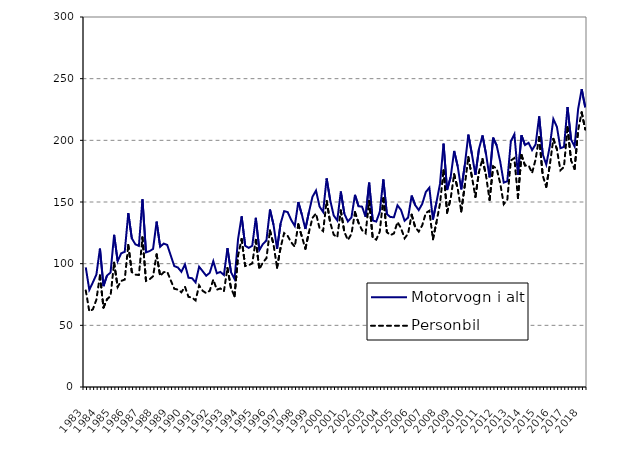
| Category | Motorvogn i alt | Personbil |
|---|---|---|
| 1983.0 | 97 | 78.3 |
| nan | 78.8 | 61.3 |
| nan | 84.8 | 63 |
| nan | 91.2 | 70.8 |
| 1984.0 | 112.2 | 90.4 |
| nan | 81.8 | 64.4 |
| nan | 90.4 | 71.1 |
| nan | 92.9 | 73.9 |
| 1985.0 | 123.4 | 100.8 |
| nan | 102 | 81.1 |
| nan | 108.4 | 86 |
| nan | 109.6 | 87.1 |
| 1986.0 | 141 | 115.2 |
| nan | 120.5 | 93.2 |
| nan | 115.7 | 91.1 |
| nan | 114.4 | 90.8 |
| 1987.0 | 152.2 | 121.3 |
| nan | 109.2 | 86.1 |
| nan | 110.1 | 87.3 |
| nan | 112 | 89.8 |
| 1988.0 | 134.1 | 107.5 |
| nan | 113.7 | 90 |
| nan | 116.3 | 93.1 |
| nan | 115.2 | 93.4 |
| 1989.0 | 106.6 | 86.4 |
| nan | 98 | 79.6 |
| nan | 96.9 | 79 |
| nan | 93.4 | 76.8 |
| 1990.0 | 99.4 | 81.3 |
| nan | 88.6 | 73.1 |
| nan | 88.2 | 72.5 |
| nan | 84.8 | 70.2 |
| 1991.0 | 97.5 | 82.4 |
| nan | 93.9 | 78 |
| nan | 90.2 | 76.1 |
| nan | 92.6 | 78.1 |
| 1992.0 | 102 | 87.1 |
| nan | 92.2 | 78.9 |
| nan | 93.3 | 79.9 |
| nan | 90.8 | 77.6 |
| 1993.0 | 112.6 | 96.5 |
| nan | 93 | 80.1 |
| nan | 87.5 | 73.6 |
| nan | 120.1 | 106.6 |
| 1994.0 | 138.4 | 120 |
| nan | 114.5 | 98.1 |
| nan | 112.8 | 98.8 |
| nan | 114.5 | 100.2 |
| 1995.0 | 137.2 | 119.3 |
| nan | 111 | 95.4 |
| nan | 115.9 | 101 |
| nan | 118.8 | 104.4 |
| 1996.0 | 143.9 | 126.9 |
| nan | 131.6 | 115.7 |
| nan | 112 | 96.7 |
| nan | 132.5 | 113.1 |
| 1997.0 | 142.6 | 124.8 |
| nan | 141.8 | 122.5 |
| nan | 135.4 | 117.3 |
| nan | 130.6 | 113.7 |
| 1998.0 | 150 | 131.9 |
| nan | 139.8 | 122 |
| nan | 128.1 | 112.1 |
| nan | 141.8 | 125.6 |
| 1999.0 | 154.2 | 137.1 |
| nan | 159.3 | 140.7 |
| nan | 146.3 | 128.7 |
| nan | 141.9 | 126.4 |
| 2000.0 | 169.1 | 150.9 |
| nan | 151.5 | 133.4 |
| nan | 139 | 123.5 |
| nan | 135.1 | 121.4 |
| 2001.0 | 158.5 | 143.1 |
| nan | 140.46 | 125.7 |
| nan | 134.24 | 119.2 |
| nan | 137.495 | 124.072 |
| 2002.0 | 155.814 | 141.724 |
| nan | 146.543 | 133.19 |
| nan | 146.231 | 127.141 |
| nan | 137.967 | 124.641 |
| 2003.0 | 165.679 | 150.811 |
| nan | 135.021 | 121.101 |
| nan | 134.111 | 119.491 |
| nan | 142.013 | 125.959 |
| 2004.0 | 168.309 | 153.043 |
| nan | 140.267 | 125.568 |
| nan | 137.77 | 123.121 |
| nan | 137.685 | 124.506 |
| 2005.0 | 147.311 | 133.756 |
| nan | 143.517 | 128.79 |
| nan | 134.783 | 120.571 |
| nan | 137.37 | 124.382 |
| 2006.0 | 155.213 | 139.728 |
| nan | 147.444 | 129.572 |
| nan | 143.451 | 126.006 |
| nan | 148.561 | 131.195 |
| 2007.0 | 158.1 | 141.084 |
| nan | 161.613 | 142.897 |
| nan | 135.821 | 119.753 |
| nan | 149.791 | 133.498 |
| 2008.0 | 164.642 | 148.614 |
| nan | 197.287 | 175.714 |
| nan | 159.718 | 141.407 |
| nan | 170.057 | 152.54 |
| 2009.0 | 191.38 | 172.559 |
| nan | 178.906 | 160.765 |
| nan | 160.234 | 142.312 |
| nan | 179.857 | 163.532 |
| 2010.0 | 204.636 | 186.507 |
| nan | 188.957 | 170.463 |
| nan | 172.077 | 154.156 |
| nan | 192.961 | 174.399 |
| 2011.0 | 204.005 | 184.86 |
| nan | 188.741 | 171.333 |
| nan | 169.934 | 151.694 |
| nan | 202.176 | 178.919 |
| 2012.0 | 195.829 | 177.072 |
| nan | 182.751 | 165.128 |
| nan | 165.73 | 148.242 |
| nan | 166.805 | 151.728 |
| 2013.0 | 199.181 | 183.653 |
| nan | 205.015 | 185.634 |
| nan | 172.044 | 153.21 |
| nan | 204.1 | 188.079 |
| 2014.0 | 196.177 | 179.552 |
| nan | 197.965 | 179.767 |
| nan | 192.105 | 173.474 |
| nan | 196.809 | 184.739 |
| 2015.0 | 219.419 | 202.592 |
| nan | 188.696 | 171.451 |
| nan | 180.388 | 162.297 |
| nan | 195.23 | 179.891 |
| 2016.0 | 217.298 | 201.197 |
| nan | 210.949 | 192.893 |
| nan | 193.648 | 175.642 |
| nan | 194.663 | 178.455 |
| 2017.0 | 227.029 | 210.738 |
| nan | 200.767 | 183.708 |
| nan | 195.059 | 176.766 |
| nan | 225.423 | 208.218 |
| 2018.0 | 241.528 | 222.678 |
| nan | 226.771 | 208.839 |